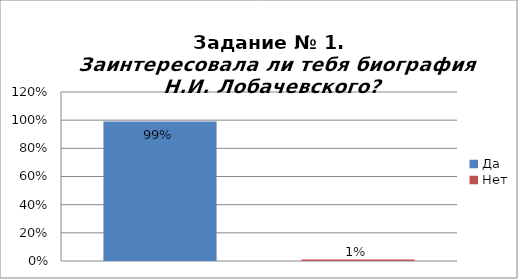
| Category | Заинтересовала ли тебя биография Н.И. Лобачевского? |
|---|---|
| Да | 0.99 |
| Нет | 0.01 |